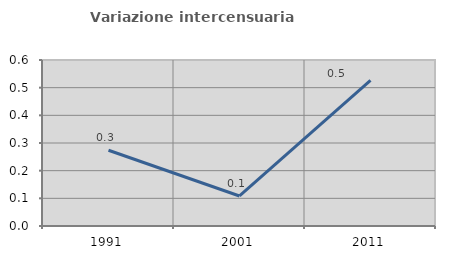
| Category | Variazione intercensuaria annua |
|---|---|
| 1991.0 | 0.274 |
| 2001.0 | 0.109 |
| 2011.0 | 0.527 |